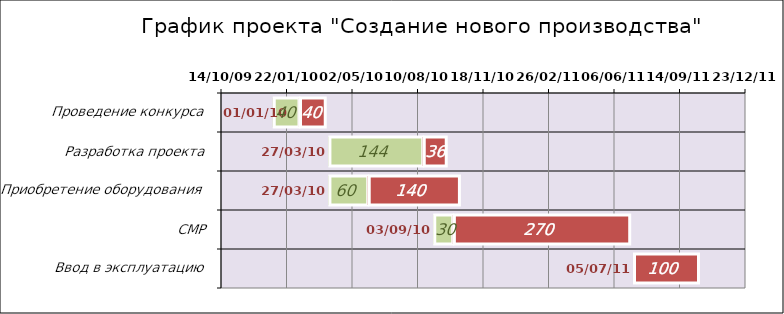
| Category | Начало работы | Выполнено, дней | Не выполнено, дней |
|---|---|---|---|
| Проведение конкурса | 1/1/10 | 40 | 40 |
| Разработка проекта | 3/27/10 | 144 | 36 |
| Приобретение оборудования | 3/27/10 | 60 | 140 |
| СМР | 9/3/10 | 30 | 270 |
| Ввод в эксплуатацию | 7/5/11 | 0 | 100 |